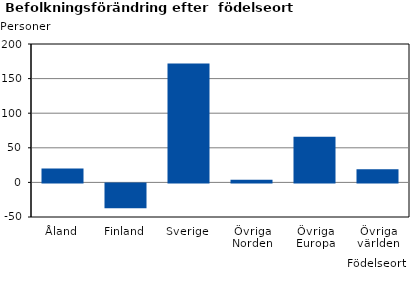
| Category | Series 0 |
|---|---|
| Åland | 20 |
| Finland | -36 |
| Sverige | 172 |
| Övriga Norden | 4 |
| Övriga Europa | 66 |
| Övriga världen | 19 |